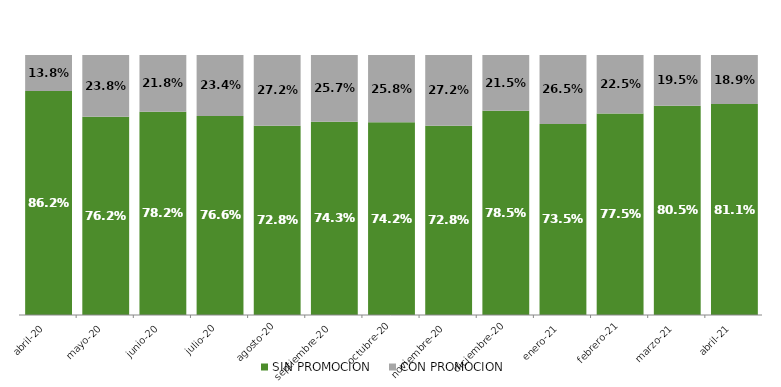
| Category | SIN PROMOCION   | CON PROMOCION   |
|---|---|---|
| 2020-04-01 | 0.862 | 0.138 |
| 2020-05-01 | 0.762 | 0.238 |
| 2020-06-01 | 0.782 | 0.218 |
| 2020-07-01 | 0.766 | 0.234 |
| 2020-08-01 | 0.728 | 0.272 |
| 2020-09-01 | 0.743 | 0.257 |
| 2020-10-01 | 0.742 | 0.258 |
| 2020-11-01 | 0.728 | 0.272 |
| 2020-12-01 | 0.785 | 0.215 |
| 2021-01-01 | 0.735 | 0.265 |
| 2021-02-01 | 0.775 | 0.225 |
| 2021-03-01 | 0.805 | 0.195 |
| 2021-04-01 | 0.811 | 0.189 |